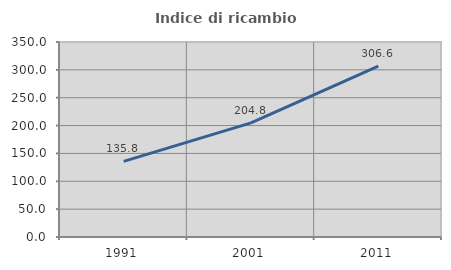
| Category | Indice di ricambio occupazionale  |
|---|---|
| 1991.0 | 135.836 |
| 2001.0 | 204.819 |
| 2011.0 | 306.557 |